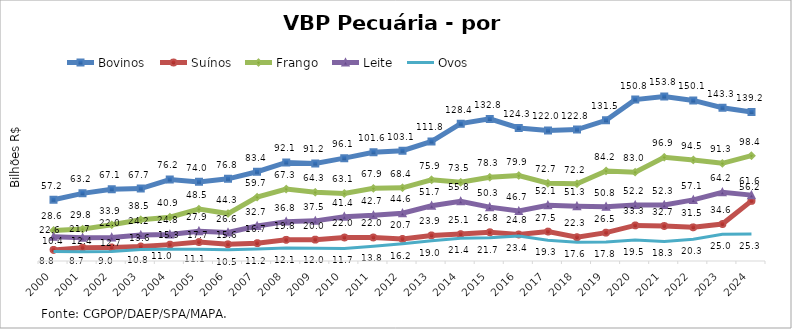
| Category | Bovinos | Suínos | Frango | Leite | Ovos |
|---|---|---|---|---|---|
| 2000 | 57.184 | 10.354 | 28.564 | 22.587 | 8.831 |
| 2001 | 63.211 | 12.422 | 29.81 | 21.735 | 8.703 |
| 2002 | 67.079 | 12.731 | 33.851 | 22.008 | 8.966 |
| 2003 | 67.7 | 13.607 | 38.537 | 24.236 | 10.846 |
| 2004 | 76.171 | 15.298 | 40.946 | 24.77 | 10.992 |
| 2005 | 73.951 | 17.737 | 48.462 | 27.86 | 11.067 |
| 2006 | 76.779 | 15.602 | 44.337 | 26.611 | 10.512 |
| 2007 | 83.441 | 16.683 | 59.694 | 32.714 | 11.172 |
| 2008 | 92.129 | 19.755 | 67.256 | 36.801 | 12.066 |
| 2009 | 91.168 | 19.969 | 64.29 | 37.519 | 12.031 |
| 2010 | 96.119 | 21.968 | 63.134 | 41.435 | 11.701 |
| 2011 | 101.613 | 22.003 | 67.909 | 42.715 | 13.788 |
| 2012 | 103.127 | 20.659 | 68.388 | 44.635 | 16.163 |
| 2013 | 111.753 | 23.92 | 75.871 | 51.652 | 19.01 |
| 2014 | 128.384 | 25.124 | 73.542 | 55.777 | 21.358 |
| 2015 | 132.803 | 26.85 | 78.282 | 50.348 | 21.747 |
| 2016 | 124.31 | 24.778 | 79.896 | 46.717 | 23.445 |
| 2017 | 121.988 | 27.507 | 72.67 | 52.053 | 19.324 |
| 2018 | 122.806 | 22.276 | 72.247 | 51.279 | 17.573 |
| 2019 | 131.498 | 26.478 | 84.194 | 50.804 | 17.797 |
| 2020 | 150.836 | 33.283 | 83.045 | 52.233 | 19.544 |
| 2021 | 153.813 | 32.69 | 96.92 | 52.291 | 18.315 |
| 2022 | 150.089 | 31.477 | 94.465 | 57.091 | 20.321 |
| 2023 | 143.291 | 34.552 | 91.279 | 64.199 | 25.04 |
| 2024 | 139.171 | 56.176 | 98.426 | 61.562 | 25.331 |